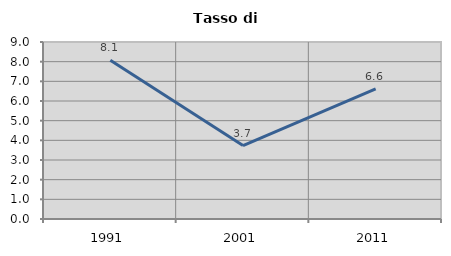
| Category | Tasso di disoccupazione   |
|---|---|
| 1991.0 | 8.069 |
| 2001.0 | 3.734 |
| 2011.0 | 6.621 |